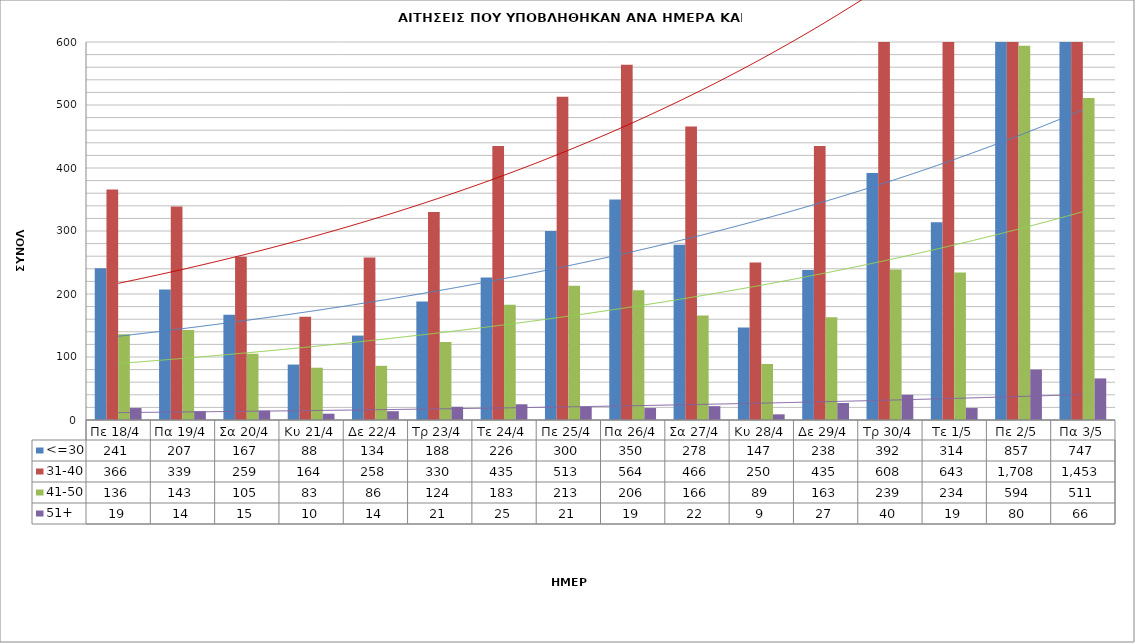
| Category | <=30 | 31-40 | 41-50 | 51+ |
|---|---|---|---|---|
| Πε 18/4 | 241 | 366 | 136 | 19 |
| Πα 19/4 | 207 | 339 | 143 | 14 |
| Σα 20/4 | 167 | 259 | 105 | 15 |
| Κυ 21/4 | 88 | 164 | 83 | 10 |
| Δε 22/4 | 134 | 258 | 86 | 14 |
| Τρ 23/4 | 188 | 330 | 124 | 21 |
| Τε 24/4 | 226 | 435 | 183 | 25 |
| Πε 25/4 | 300 | 513 | 213 | 21 |
| Πα 26/4 | 350 | 564 | 206 | 19 |
| Σα 27/4 | 278 | 466 | 166 | 22 |
| Κυ 28/4 | 147 | 250 | 89 | 9 |
| Δε 29/4 | 238 | 435 | 163 | 27 |
| Τρ 30/4 | 392 | 608 | 239 | 40 |
| Τε 1/5 | 314 | 643 | 234 | 19 |
| Πε 2/5 | 857 | 1708 | 594 | 80 |
| Πα 3/5 | 747 | 1453 | 511 | 66 |